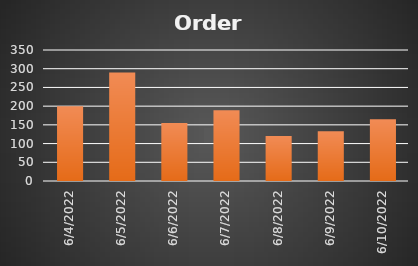
| Category | Orders |
|---|---|
| 6/4/22 | 200 |
| 6/5/22 | 290 |
| 6/6/22 | 155 |
| 6/7/22 | 189 |
| 6/8/22 | 120 |
| 6/9/22 | 133 |
| 6/10/22 | 165 |